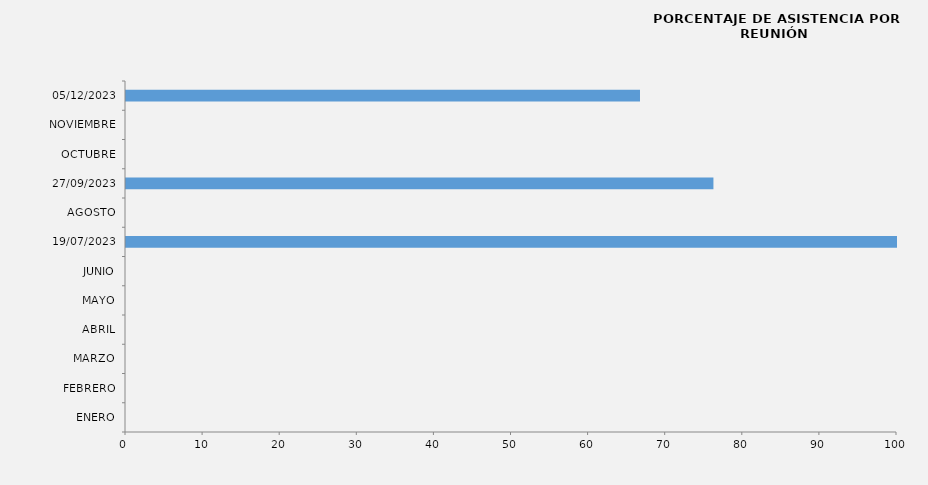
| Category | Series 0 |
|---|---|
| ENERO | 0 |
| FEBRERO | 0 |
| MARZO | 0 |
| ABRIL | 0 |
| MAYO | 0 |
| JUNIO | 0 |
| 19/07/2023 | 100 |
| AGOSTO | 0 |
| 27/09/2023 | 76.19 |
| OCTUBRE | 0 |
| NOVIEMBRE | 0 |
| 05/12/2023 | 66.667 |